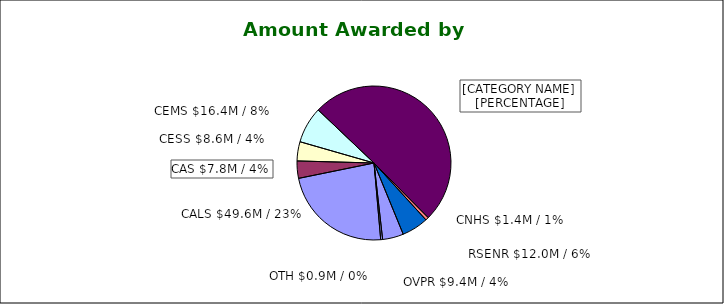
| Category | Series 0 |
|---|---|
| CALS $49.6M / | 0.232 |
| CAS $7.8M / | 0.036 |
| CESS $8.6M / | 0.04 |
| CEMS $16.4M / | 0.076 |
| LCOM $108.1M / | 0.505 |
| CNHS $1.4M / | 0.007 |
| RSENR $12.0M / | 0.056 |
| OVPR $9.4M / | 0.044 |
| OTH $0.9M / | 0.004 |